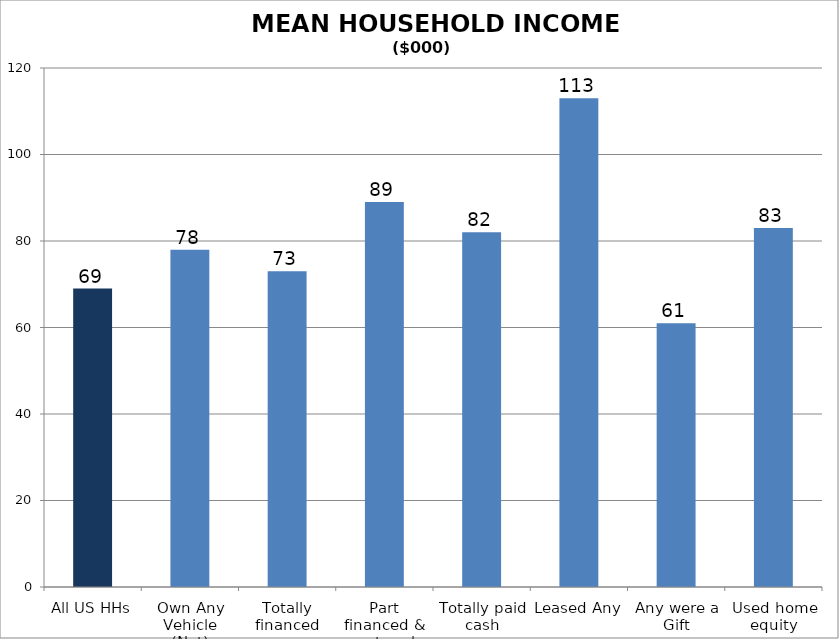
| Category | Mean of HHI ($000) |
|---|---|
| All US HHs | 69 |
| Own Any Vehicle (Net) | 78 |
| Totally financed any | 73 |
| Part financed & part cash | 89 |
| Totally paid cash | 82 |
| Leased Any | 113 |
| Any were a Gift | 61 |
| Used home equity | 83 |